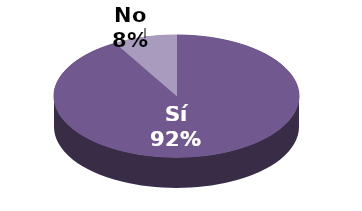
| Category | Series 1 |
|---|---|
| Sí | 22 |
| No | 2 |